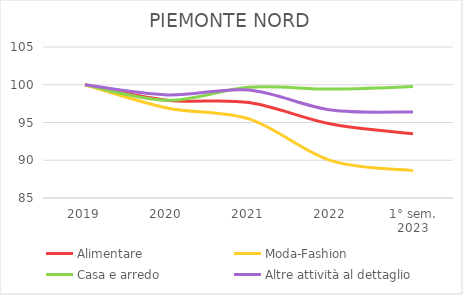
| Category | Alimentare | Moda-Fashion | Casa e arredo | Altre attività al dettaglio |
|---|---|---|---|---|
| 2019 | 100 | 100 | 100 | 100 |
| 2020 | 97.948 | 96.92 | 97.936 | 98.654 |
| 2021 | 97.642 | 95.475 | 99.67 | 99.3 |
| 2022 | 94.793 | 89.943 | 99.422 | 96.645 |
| 1° sem.
2023 | 93.507 | 88.624 | 99.752 | 96.387 |